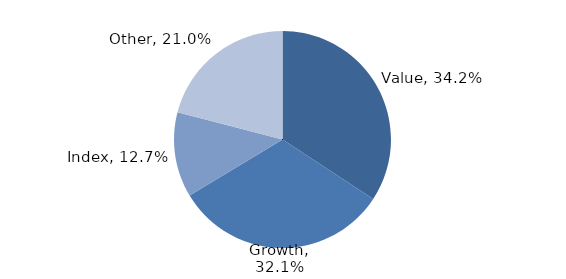
| Category | Investment Style |
|---|---|
| Value | 0.342 |
| Growth | 0.321 |
| Index | 0.127 |
| Other | 0.21 |